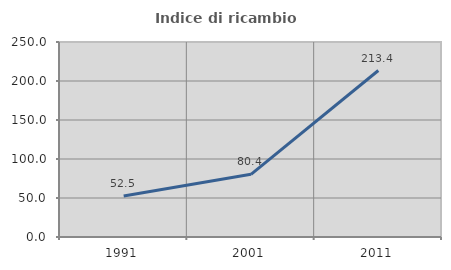
| Category | Indice di ricambio occupazionale  |
|---|---|
| 1991.0 | 52.467 |
| 2001.0 | 80.386 |
| 2011.0 | 213.449 |